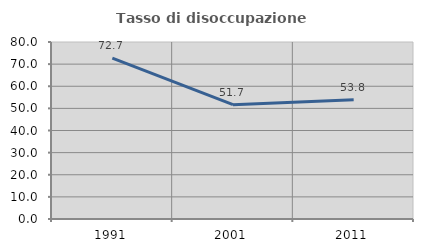
| Category | Tasso di disoccupazione giovanile  |
|---|---|
| 1991.0 | 72.673 |
| 2001.0 | 51.659 |
| 2011.0 | 53.846 |